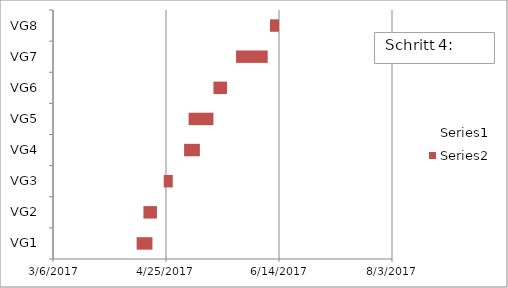
| Category | Series 0 | Series 1 |
|---|---|---|
| VG1 | 4/12/17 | 7 |
| VG2 | 4/15/17 | 6 |
| VG3 | 4/24/17 | 4 |
| VG4 | 5/3/17 | 7 |
| VG5 | 5/5/17 | 11 |
| VG6 | 5/16/17 | 6 |
| VG7 | 5/26/17 | 14 |
| VG8 | 6/10/17 | 4 |